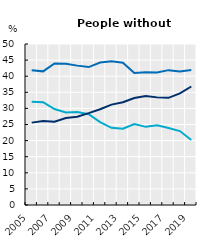
| Category | Low | Medium | High |
|---|---|---|---|
| 2005.0 | 32.061 | 41.868 | 25.581 |
| 2006.0 | 31.926 | 41.506 | 26.083 |
| 2007.0 | 29.791 | 43.938 | 25.834 |
| 2008.0 | 28.742 | 43.838 | 27.008 |
| 2009.0 | 28.899 | 43.285 | 27.418 |
| 2010.0 | 28.213 | 42.833 | 28.52 |
| 2011.0 | 25.763 | 44.224 | 29.733 |
| 2012.0 | 23.979 | 44.615 | 31.173 |
| 2013.0 | 23.683 | 44.194 | 31.921 |
| 2014.0 | 25.12 | 40.99 | 33.217 |
| 2015.0 | 24.27 | 41.211 | 33.878 |
| 2016.0 | 24.735 | 41.127 | 33.423 |
| 2017.0 | 23.908 | 41.882 | 33.281 |
| 2018.0 | 22.96 | 41.492 | 34.653 |
| 2019.0 | 20.189 | 41.947 | 36.797 |